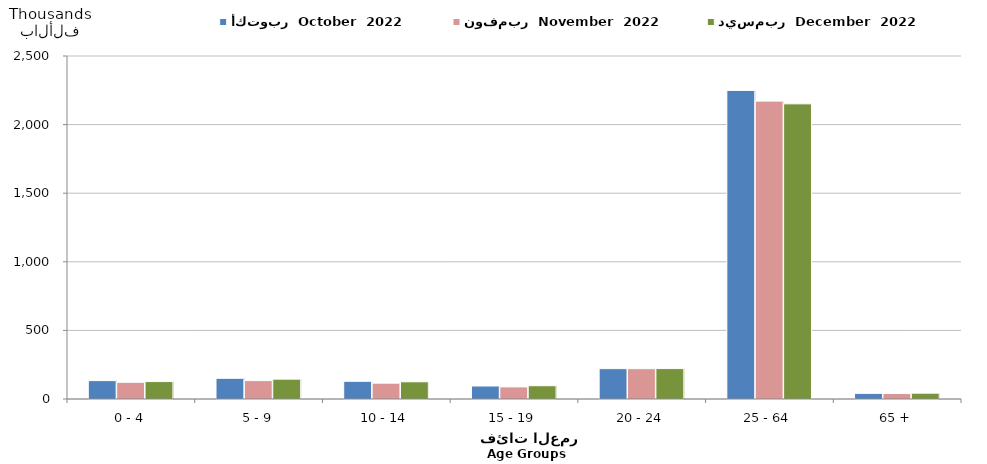
| Category | أكتوبر  October  2022 | نوفمبر  November  2022 | ديسمبر  December  2022 |
|---|---|---|---|
| 0 - 4 | 133983 | 121615 | 126875 |
| 5 - 9 | 150911 | 134075 | 144636 |
| 10 - 14 | 129145 | 115414 | 125455 |
| 15 - 19 | 94767 | 88197 | 96765 |
| 20 - 24 | 221119 | 221113 | 221649 |
| 25 - 64 | 2249247 | 2171159 | 2151378 |
| 65 + | 40908 | 39772 | 42376 |